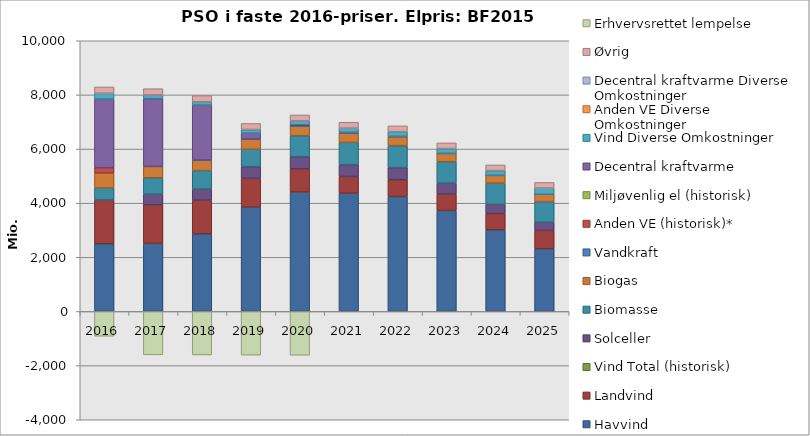
| Category | Havvind | Landvind | Vind Total (historisk) | Solceller | Biomasse | Biogas | Vandkraft | Anden VE (historisk)* | Miljøvenlig el (historisk) | Decentral kraftvarme | Vind Diverse Omkostninger | Anden VE Diverse Omkostninger | Decentral kraftvarme Diverse Omkostninger | Øvrig | Erhvervsrettet lempelse |
|---|---|---|---|---|---|---|---|---|---|---|---|---|---|---|---|
| 2016 | 2503.6 | 1615.534 | 0 | 0 | 442.278 | 552.308 | 0 | 195.5 | 0 | 2539.565 | 208.025 | 0 | 6.18 | 231.18 | -915.921 |
| 2017 | 2516.913 | 1428.856 | 0 | 388.036 | 604.255 | 418.933 | 3.251 | 0 | 0 | 2500.336 | 132.453 | 0 | 6.913 | 229.085 | -1602.039 |
| 2018 | 2866.509 | 1245.274 | 0 | 409.1 | 683.366 | 386.469 | 2.999 | 0 | 0 | 2029.313 | 118.338 | 0 | 6.775 | 225.301 | -1604.96 |
| 2019 | 3854.564 | 1064.056 | 0 | 431.197 | 644.559 | 370.906 | 2.848 | 0 | 0 | 219.254 | 128.304 | 0 | 6.659 | 222.225 | -1612.378 |
| 2020 | 4413.165 | 858.704 | 0 | 446.575 | 776.156 | 359.279 | 2.7 | 0 | 0 | 40.086 | 138.176 | 0 | 6.533 | 218.792 | -1616.669 |
| 2021 | 4369.553 | 615.383 | 0 | 439.725 | 821.05 | 348.238 | 2.46 | 0 | 0 | 22.888 | 148.486 | 0 | 6.427 | 216.038 | 0 |
| 2022 | 4247.24 | 620.993 | 0 | 446.477 | 810.739 | 331.843 | 2.296 | 0 | 0 | 11.41 | 164.486 | 0 | 6.323 | 213.301 | 0 |
| 2023 | 3732.809 | 605.843 | 0 | 401.682 | 793.322 | 304.642 | 2.162 | 0 | 0 | 2.411 | 168.454 | 0 | 6.22 | 210.587 | 0 |
| 2024 | 3016.009 | 601.441 | 0 | 340.752 | 780.515 | 288.742 | 2.076 | 0 | 0 | 0.697 | 168.976 | 0 | 6.12 | 207.963 | 0 |
| 2025 | 2319.372 | 674.973 | 0 | 300.656 | 764.303 | 270.664 | 1.961 | 0 | 0 | 0 | 221.974 | 0 | 6.022 | 205.398 | 0 |